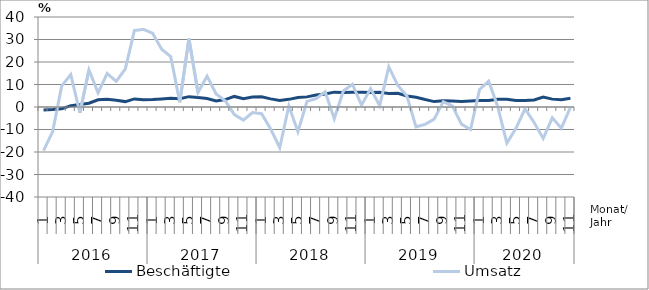
| Category | Beschäftigte | Umsatz |
|---|---|---|
| 0 | -1.3 | -19.4 |
| 1 | -1.1 | -11 |
| 2 | -0.8 | 9.4 |
| 3 | 0.6 | 14.4 |
| 4 | 1.1 | -2.6 |
| 5 | 1.7 | 16.5 |
| 6 | 3.2 | 6.3 |
| 7 | 3.4 | 14.9 |
| 8 | 3 | 11.4 |
| 9 | 2.4 | 16.9 |
| 10 | 3.6 | 34 |
| 11 | 3.2 | 34.5 |
| 12 | 3.3 | 32.8 |
| 13 | 3.6 | 25.7 |
| 14 | 3.9 | 22.4 |
| 15 | 3.7 | 2.1 |
| 16 | 4.6 | 30.4 |
| 17 | 4.2 | 6.4 |
| 18 | 3.8 | 13.7 |
| 19 | 2.7 | 5.8 |
| 20 | 3.3 | 2.8 |
| 21 | 4.7 | -3.4 |
| 22 | 3.7 | -5.8 |
| 23 | 4.4 | -2.5 |
| 24 | 4.5 | -3 |
| 25 | 3.6 | -9.8 |
| 26 | 2.9 | -18.1 |
| 27 | 3.4 | 0.5 |
| 28 | 4.2 | -11 |
| 29 | 4.5 | 2.5 |
| 30 | 5.3 | 3.7 |
| 31 | 5.8 | 6.8 |
| 32 | 6.6 | -5.2 |
| 33 | 6.5 | 7.1 |
| 34 | 6.6 | 10.1 |
| 35 | 6.6 | 0.8 |
| 36 | 6.4 | 8.2 |
| 37 | 6.5 | 0.6 |
| 38 | 6 | 17.8 |
| 39 | 6.1 | 9.6 |
| 40 | 4.9 | 4.9 |
| 41 | 4.3 | -8.8 |
| 42 | 3.3 | -7.7 |
| 43 | 2.4 | -5.4 |
| 44 | 2.8 | 2.4 |
| 45 | 2.7 | 0.5 |
| 46 | 2.5 | -7.6 |
| 47 | 2.7 | -10 |
| 48 | 2.9 | 7.8 |
| 49 | 2.9 | 11.5 |
| 50 | 3.4 | 0.1 |
| 51 | 3.4 | -16.1 |
| 52 | 2.9 | -9.5 |
| 53 | 2.9 | -0.8 |
| 54 | 3.1 | -6.9 |
| 55 | 4.4 | -14 |
| 56 | 3.5 | -4.8 |
| 57 | 3.2 | -9.4 |
| 58 | 3.9 | -0.1 |